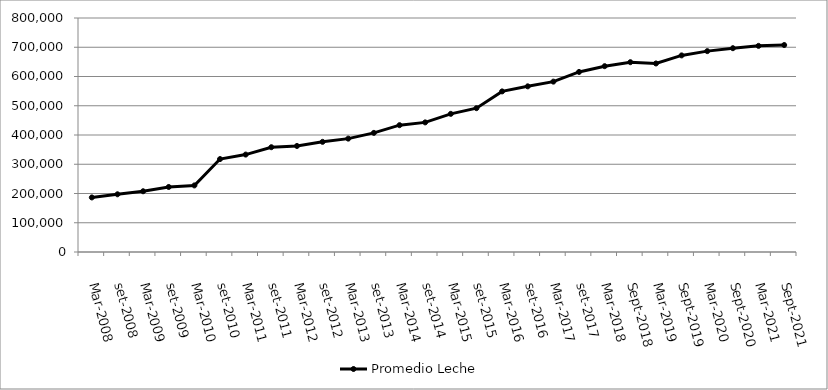
| Category | Promedio Leche  |
|---|---|
| mar-2008 | 186528 |
| set-2008 | 197292 |
| mar-2009 | 207648 |
| set-2009 | 222353 |
| mar-2010 | 227619 |
| set-2010 | 317718 |
| mar-2011 | 333095 |
| set-2011 | 358254 |
| mar-2012 | 362509 |
| set-2012 | 376620 |
| mar-2013 | 387638 |
| set-2013 | 407294 |
| mar-2014 | 433571 |
| set-2014 | 443114 |
| mar-2015 | 472333 |
| set-2015 | 491728 |
| mar-2016 | 549068 |
| set-2016 | 566338 |
| mar-2017 | 582470 |
| set-2017 | 615581 |
| mar-2018 | 635290 |
| sep-2018 | 648922 |
| mar-2019 | 644563 |
| sep-2019 | 672128 |
| mar-2020 | 686726 |
| sep-2020 | 696775 |
| mar-2021 | 704719 |
| sep-2021 | 707612 |